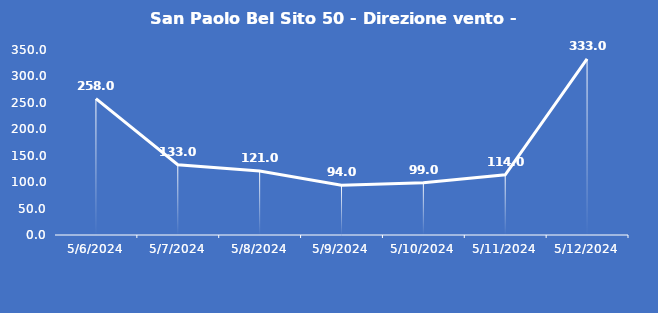
| Category | San Paolo Bel Sito 50 - Direzione vento - Grezzo (°N) |
|---|---|
| 5/6/24 | 258 |
| 5/7/24 | 133 |
| 5/8/24 | 121 |
| 5/9/24 | 94 |
| 5/10/24 | 99 |
| 5/11/24 | 114 |
| 5/12/24 | 333 |